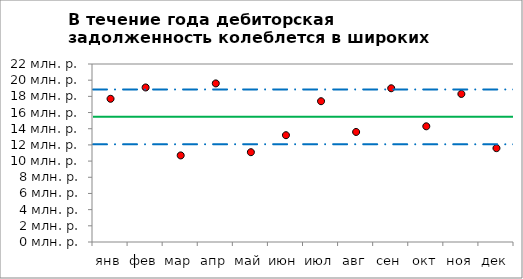
| Category | Объем дебиторской задолженности |
|---|---|
| янв | 17700000 |
| фев | 19100000 |
| мар | 10700000 |
| апр | 19600000 |
| май | 11100000 |
| июн | 13200000 |
| июл | 17400000 |
| авг | 13600000 |
| сен | 19000000 |
| окт | 14300000 |
| ноя | 18300000 |
| дек | 11600000 |